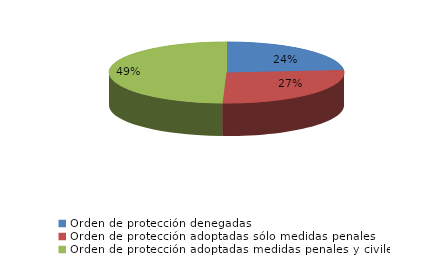
| Category | Series 0 |
|---|---|
| Orden de protección denegadas | 44 |
| Orden de protección adoptadas sólo medidas penales | 50 |
| Orden de protección adoptadas medidas penales y civiles | 92 |